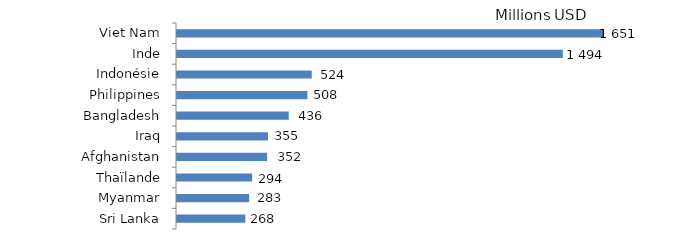
| Category | Series 0 |
|---|---|
| Viet Nam | 1651.425 |
| Inde | 1494.17 |
| Indonésie | 524.275 |
| Philippines | 507.615 |
| Bangladesh | 435.52 |
| Iraq | 355.39 |
| Afghanistan | 351.935 |
| Thaïlande | 294.24 |
| Myanmar | 282.53 |
| Sri Lanka | 267.79 |